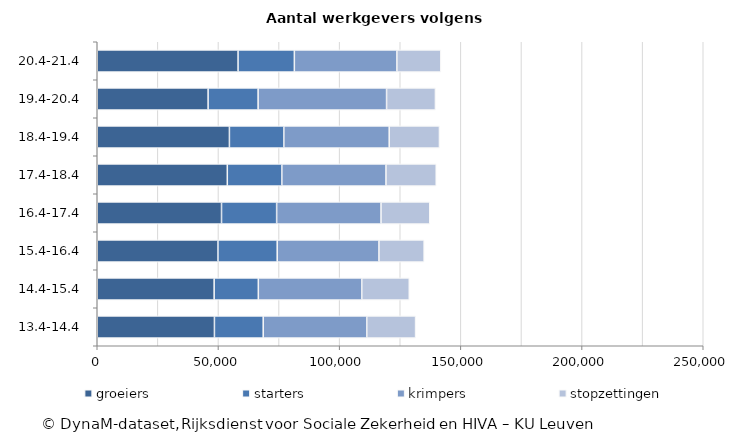
| Category | groeiers | starters | krimpers | stopzettingen |
|---|---|---|---|---|
| 20.4-21.4 | 58089 | 23226 | 42288 | 18139 |
| 19.4-20.4 | 45732 | 20633 | 52990 | 20157 |
| 18.4-19.4 | 54526 | 22447 | 43476 | 20719 |
| 17.4-18.4 | 53653 | 22494 | 42959 | 20735 |
| 16.4-17.4 | 51269 | 22741 | 43058 | 20107 |
| 15.4-16.4 | 49791 | 24449 | 41969 | 18651 |
| 14.4-15.4 | 48226 | 18223 | 42674 | 19599 |
| 13.4-14.4 | 48341 | 20125 | 42718 | 20144 |